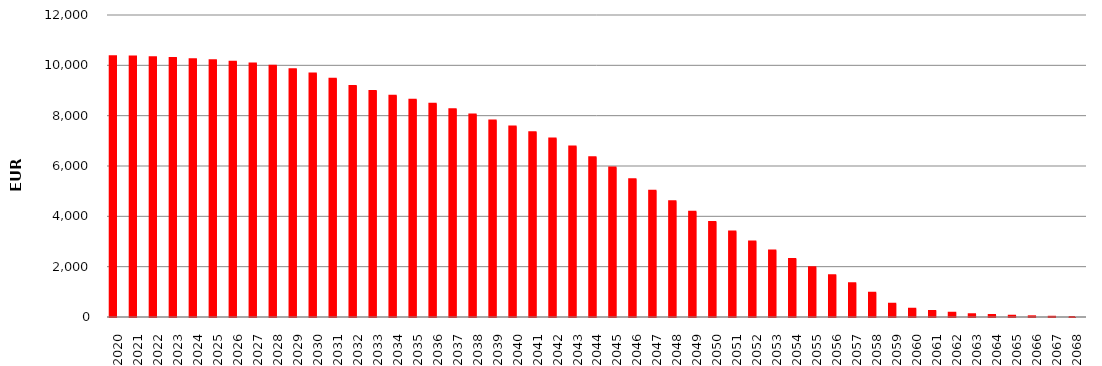
| Category | 10364212796 | SumOfMont Cred Ced act |
|---|---|---|
| 2020 | 10361957097.09 | 2255698.91 |
| 2021 | 10349734800.38 | 12222296.71 |
| 2022 | 10325436845.65 | 24297954.73 |
| 2023 | 10289758728.42 | 35678117.23 |
| 2024 | 10245723065.5 | 44035662.92 |
| 2025 | 10200830547.41 | 44892518.09 |
| 2026 | 10146511689.43 | 54318857.98 |
| 2027 | 10072677315.32 | 73834374.11 |
| 2028 | 9985169654.37 | 87507660.95 |
| 2029 | 9847666335.04 | 137503319.33 |
| 2030 | 9678112597.2 | 169553737.84 |
| 2031 | 9468201609.7 | 209910987.5 |
| 2032 | 9179551901.38 | 288649708.32 |
| 2033 | 8975278765.6 | 204273135.78 |
| 2034 | 8786653425.84 | 188625339.76 |
| 2035 | 8634344525.34 | 152308900.5 |
| 2036 | 8468785285 | 165559240.34 |
| 2037 | 8253224719.48 | 215560565.52 |
| 2038 | 8041455248.17 | 211769471.31 |
| 2039 | 7809305309.98 | 232149938.19 |
| 2040 | 7568697418.54 | 240607891.44 |
| 2041 | 7341452647.89 | 227244770.65 |
| 2042 | 7088839166.55 | 252613481.34 |
| 2043 | 6773854526.17 | 314984640.38 |
| 2044 | 6343887989.72 | 429966536.45 |
| 2045 | 5944969697.72 | 398918292 |
| 2046 | 5475439665.85 | 469530031.87 |
| 2047 | 5017833671.69 | 457605994.16 |
| 2048 | 4595554828.81 | 422278842.88 |
| 2049 | 4182215241.87 | 413339586.94 |
| 2050 | 3771270758.54 | 410944483.33 |
| 2051 | 3397095212.18 | 374175546.36 |
| 2052 | 3004716872.16 | 392378340.02 |
| 2053 | 2643696872.15 | 361020000.01 |
| 2054 | 2304961864.28 | 338735007.87 |
| 2055 | 1972299619.66 | 332662244.62 |
| 2056 | 1661703811.97 | 310595807.69 |
| 2057 | 1337013541.43 | 324690270.54 |
| 2058 | 960063036.12 | 376950505.31 |
| 2059 | 525411674.92 | 434651361.2 |
| 2060 | 326959038.4 | 198452636.52 |
| 2061 | 243357980.92 | 83601057.48 |
| 2062 | 173311229.43 | 70046751.49 |
| 2063 | 111750061.4 | 61561168.03 |
| 2064 | 79766452.2 | 31983609.2 |
| 2065 | 50004934.25 | 29761517.95 |
| 2066 | 26754470.81 | 23250463.44 |
| 2067 | 9231743.99 | 17522726.82 |
| 2068 | 0 | 9231743.99 |